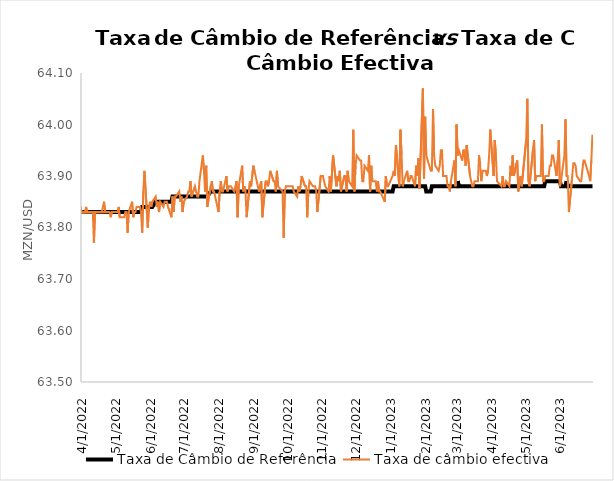
| Category | Taxa de Câmbio de Referência | Taxa de câmbio efectiva |
|---|---|---|
| 10/1/21 | 63.83 | 63.8 |
| 10/5/21 | 63.83 | 63.83 |
| 10/6/21 | 63.83 | 63.76 |
| 10/7/21 | 63.83 | 63.82 |
| 10/8/21 | 63.83 | 63.82 |
| 10/11/21 | 63.83 | 63.77 |
| 10/12/21 | 63.83 | 63.81 |
| 10/13/21 | 63.83 | 63.82 |
| 10/14/21 | 63.83 | 63.82 |
| 10/15/21 | 63.83 | 63.82 |
| 10/18/21 | 63.83 | 63.76 |
| 10/19/21 | 63.83 | 63.76 |
| 10/20/21 | 63.83 | 63.82 |
| 10/21/21 | 63.83 | 63.78 |
| 10/22/21 | 63.83 | 63.81 |
| 10/25/21 | 63.83 | 63.82 |
| 10/26/21 | 63.83 | 63.79 |
| 10/27/21 | 63.83 | 63.8 |
| 10/28/21 | 63.83 | 63.83 |
| 10/29/21 | 63.83 | 63.82 |
| 11/1/21 | 63.83 | 63.84 |
| 11/2/21 | 63.83 | 63.81 |
| 11/3/21 | 63.83 | 63.83 |
| 11/4/21 | 63.83 | 63.82 |
| 11/5/21 | 63.83 | 63.83 |
| 11/8/21 | 63.83 | 63.79 |
| 11/9/21 | 63.83 | 63.79 |
| 11/11/21 | 63.83 | 63.84 |
| 11/12/21 | 63.83 | 63.83 |
| 11/15/21 | 63.83 | 63.78 |
| 11/16/21 | 63.83 | 63.7 |
| 11/17/21 | 63.83 | 63.84 |
| 11/18/21 | 63.83 | 63.81 |
| 11/19/21 | 63.83 | 63.8 |
| 11/22/21 | 63.83 | 63.78 |
| 11/23/21 | 63.83 | 63.81 |
| 11/24/21 | 63.83 | 63.81 |
| 11/25/21 | 63.83 | 63.81 |
| 11/26/21 | 63.83 | 63.84 |
| 11/29/21 | 63.83 | 63.8 |
| 11/30/21 | 63.83 | 63.81 |
| 12/1/21 | 63.83 | 63.79 |
| 12/2/21 | 63.83 | 63.79 |
| 12/3/21 | 63.83 | 63.82 |
| 12/6/21 | 63.83 | 63.75 |
| 12/7/21 | 63.83 | 63.78 |
| 12/8/21 | 63.83 | 63.82 |
| 12/9/21 | 63.83 | 63.82 |
| 12/10/21 | 63.83 | 63.82 |
| 12/13/21 | 63.83 | 63.83 |
| 12/14/21 | 63.83 | 63.76 |
| 12/15/21 | 63.83 | 63.82 |
| 12/16/21 | 63.83 | 63.8 |
| 12/17/21 | 63.83 | 63.79 |
| 12/20/21 | 63.83 | 63.84 |
| 12/21/21 | 63.83 | 63.79 |
| 12/22/21 | 63.83 | 63.8 |
| 12/23/21 | 63.83 | 63.82 |
| 12/27/21 | 63.83 | 63.77 |
| 12/28/21 | 63.83 | 63.74 |
| 12/29/21 | 63.83 | 63.76 |
| 12/30/21 | 63.83 | 63.78 |
| 12/31/21 | 63.83 | 63.72 |
| 1/3/22 | 63.83 | 63.79 |
| 1/4/22 | 63.83 | 63.81 |
| 1/5/22 | 63.83 | 63.8 |
| 1/6/22 | 63.83 | 63.81 |
| 1/7/22 | 63.83 | 63.77 |
| 1/10/22 | 63.83 | 63.79 |
| 1/12/22 | 63.83 | 63.83 |
| 1/13/22 | 63.83 | 63.83 |
| 1/14/22 | 63.83 | 63.83 |
| 1/17/22 | 63.83 | 63.83 |
| 1/18/22 | 63.83 | 63.83 |
| 1/19/22 | 63.83 | 63.8 |
| 1/20/22 | 63.83 | 63.83 |
| 1/21/22 | 63.83 | 63.83 |
| 1/24/22 | 63.83 | 63.81 |
| 1/25/22 | 63.83 | 63.82 |
| 1/26/22 | 63.83 | 63.83 |
| 1/27/22 | 63.83 | 63.8 |
| 1/28/22 | 63.83 | 63.83 |
| 1/31/22 | 63.83 | 63.81 |
| 2/1/22 | 63.83 | 63.83 |
| 2/2/22 | 63.83 | 63.82 |
| 2/3/22 | 63.83 | 63.78 |
| 2/4/22 | 63.83 | 63.84 |
| 2/7/22 | 63.83 | 63.83 |
| 2/8/22 | 63.83 | 63.85 |
| 2/9/22 | 63.83 | 63.8 |
| 2/10/22 | 63.83 | 63.83 |
| 2/11/22 | 63.83 | 63.83 |
| 2/14/22 | 63.83 | 63.83 |
| 2/15/22 | 63.83 | 63.81 |
| 2/16/22 | 63.83 | 63.81 |
| 2/17/22 | 63.83 | 63.83 |
| 2/18/22 | 63.83 | 63.83 |
| 2/21/22 | 63.83 | 63.84 |
| 2/22/22 | 63.83 | 63.83 |
| 2/23/22 | 63.83 | 63.83 |
| 2/24/22 | 63.83 | 63.81 |
| 2/25/22 | 63.83 | 63.82 |
| 2/28/22 | 63.83 | 63.83 |
| 3/1/22 | 63.83 | 63.79 |
| 3/2/22 | 63.83 | 63.81 |
| 3/3/22 | 63.83 | 63.83 |
| 3/4/22 | 63.83 | 63.83 |
| 3/7/22 | 63.83 | 63.82 |
| 3/8/22 | 63.83 | 63.83 |
| 3/9/22 | 63.83 | 63.76 |
| 3/10/22 | 63.83 | 63.82 |
| 3/11/22 | 63.83 | 63.83 |
| 3/14/22 | 63.83 | 63.83 |
| 3/15/22 | 63.83 | 63.82 |
| 3/16/22 | 63.83 | 63.82 |
| 3/17/22 | 63.83 | 63.82 |
| 3/18/22 | 63.83 | 63.84 |
| 3/21/22 | 63.83 | 63.8 |
| 3/22/22 | 63.83 | 63.8 |
| 3/23/22 | 63.83 | 63.82 |
| 3/24/22 | 63.83 | 63.84 |
| 3/25/22 | 63.83 | 63.83 |
| 3/28/22 | 63.83 | 63.73 |
| 3/29/22 | 63.83 | 63.88 |
| 3/30/22 | 63.83 | 63.82 |
| 3/31/22 | 63.83 | 63.84 |
| 4/1/22 | 63.83 | 63.83 |
| 4/4/22 | 63.83 | 63.83 |
| 4/5/22 | 63.83 | 63.84 |
| 4/6/22 | 63.83 | 63.83 |
| 4/8/22 | 63.83 | 63.83 |
| 4/11/22 | 63.83 | 63.83 |
| 4/12/22 | 63.83 | 63.77 |
| 4/13/22 | 63.83 | 63.83 |
| 4/14/22 | 63.83 | 63.83 |
| 4/18/22 | 63.83 | 63.83 |
| 4/19/22 | 63.83 | 63.83 |
| 4/20/22 | 63.83 | 63.84 |
| 4/21/22 | 63.83 | 63.85 |
| 4/22/22 | 63.83 | 63.83 |
| 4/25/20 | 63.83 | 63.81 |
| 4/26/22 | 63.83 | 63.83 |
| 4/27/22 | 63.83 | 63.82 |
| 4/28/22 | 63.83 | 63.83 |
| 4/29/22 | 63.83 | 63.83 |
| 5/3/22 | 63.83 | 63.83 |
| 5/4/22 | 63.83 | 63.84 |
| 5/5/22 | 63.83 | 63.82 |
| 5/6/22 | 63.83 | 63.82 |
| 5/9/22 | 63.83 | 63.82 |
| 5/10/22 | 63.83 | 63.83 |
| 5/11/22 | 63.83 | 63.83 |
| 5/12/22 | 63.83 | 63.79 |
| 5/13/22 | 63.83 | 63.83 |
| 5/16/22 | 63.83 | 63.85 |
| 5/17/22 | 63.83 | 63.82 |
| 5/18/22 | 63.83 | 63.83 |
| 5/19/22 | 63.83 | 63.83 |
| 5/20/22 | 63.83 | 63.84 |
| 5/23/22 | 63.83 | 63.84 |
| 5/24/22 | 63.83 | 63.83 |
| 5/25/22 | 63.84 | 63.79 |
| 5/26/22 | 63.84 | 63.87 |
| 5/27/22 | 63.84 | 63.91 |
| 5/30/22 | 63.84 | 63.8 |
| 5/31/22 | 63.84 | 63.84 |
| 6/1/22 | 63.84 | 63.85 |
| 6/2/22 | 63.84 | 63.84 |
| 6/3/22 | 63.84 | 63.85 |
| 6/6/22 | 63.85 | 63.86 |
| 6/7/22 | 63.85 | 63.84 |
| 6/8/22 | 63.85 | 63.85 |
| 6/9/22 | 63.85 | 63.83 |
| 6/10/22 | 63.85 | 63.85 |
| 6/13/22 | 63.85 | 63.84 |
| 6/14/22 | 63.85 | 63.85 |
| 6/15/22 | 63.85 | 63.85 |
| 6/16/22 | 63.85 | 63.85 |
| 6/17/22 | 63.85 | 63.84 |
| 6/20/22 | 63.85 | 63.82 |
| 6/21/22 | 63.86 | 63.86 |
| 6/22/22 | 63.86 | 63.83 |
| 6/23/22 | 63.86 | 63.86 |
| 6/24/22 | 63.86 | 63.86 |
| 6/27/22 | 63.86 | 63.87 |
| 6/28/22 | 63.86 | 63.85 |
| 6/29/22 | 63.86 | 63.86 |
| 6/30/22 | 63.86 | 63.83 |
| 7/1/22 | 63.86 | 63.85 |
| 7/4/22 | 63.86 | 63.86 |
| 7/5/22 | 63.86 | 63.87 |
| 7/6/22 | 63.86 | 63.87 |
| 7/7/22 | 63.86 | 63.89 |
| 7/8/22 | 63.86 | 63.86 |
| 7/11/22 | 63.86 | 63.88 |
| 7/12/22 | 63.86 | 63.87 |
| 7/13/22 | 63.86 | 63.86 |
| 7/14/22 | 63.86 | 63.86 |
| 7/15/22 | 63.86 | 63.89 |
| 7/18/22 | 63.86 | 63.94 |
| 7/19/22 | 63.86 | 63.91 |
| 7/20/22 | 63.86 | 63.87 |
| 7/21/22 | 63.86 | 63.92 |
| 7/22/22 | 63.86 | 63.84 |
| 7/25/22 | 63.87 | 63.88 |
| 7/26/22 | 63.87 | 63.89 |
| 7/27/22 | 63.87 | 63.87 |
| 7/28/22 | 63.87 | 63.87 |
| 7/29/22 | 63.87 | 63.86 |
| 8/1/22 | 63.87 | 63.83 |
| 8/2/22 | 63.87 | 63.87 |
| 8/3/22 | 63.87 | 63.89 |
| 8/4/22 | 63.87 | 63.87 |
| 8/5/22 | 63.87 | 63.87 |
| 8/8/22 | 63.87 | 63.9 |
| 8/9/22 | 63.87 | 63.87 |
| 8/10/22 | 63.87 | 63.88 |
| 8/11/22 | 63.87 | 63.88 |
| 8/12/22 | 63.87 | 63.88 |
| 8/15/22 | 63.87 | 63.87 |
| 8/16/22 | 63.87 | 63.88 |
| 8/17/22 | 63.87 | 63.89 |
| 8/18/22 | 63.87 | 63.82 |
| 8/19/22 | 63.87 | 63.88 |
| 8/22/22 | 63.87 | 63.92 |
| 8/23/22 | 63.87 | 63.87 |
| 8/24/22 | 63.87 | 63.88 |
| 8/25/22 | 63.87 | 63.87 |
| 8/26/22 | 63.87 | 63.82 |
| 8/29/22 | 63.87 | 63.89 |
| 8/30/22 | 63.87 | 63.88 |
| 9/1/22 | 63.87 | 63.92 |
| 9/2/22 | 63.87 | 63.91 |
| 9/5/22 | 63.87 | 63.88 |
| 9/6/22 | 63.87 | 63.87 |
| 9/8/22 | 63.87 | 63.89 |
| 9/9/22 | 63.87 | 63.82 |
| 9/12/22 | 63.87 | 63.89 |
| 9/13/22 | 63.87 | 63.89 |
| 9/14/22 | 63.87 | 63.88 |
| 9/15/22 | 63.87 | 63.89 |
| 9/16/22 | 63.87 | 63.91 |
| 9/19/22 | 63.87 | 63.89 |
| 9/20/22 | 63.87 | 63.89 |
| 9/21/22 | 63.87 | 63.87 |
| 9/22/22 | 63.87 | 63.91 |
| 9/23/22 | 63.87 | 63.88 |
| 9/27/22 | 63.87 | 63.87 |
| 9/28/22 | 63.87 | 63.78 |
| 9/29/22 | 63.87 | 63.87 |
| 9/30/22 | 63.87 | 63.88 |
| 10/3/22 | 63.87 | 63.88 |
| 10/5/22 | 63.87 | 63.88 |
| 10/6/22 | 63.87 | 63.88 |
| 10/7/22 | 63.87 | 63.87 |
| 10/10/22 | 63.87 | 63.86 |
| 10/11/22 | 63.87 | 63.88 |
| 10/12/22 | 63.87 | 63.87 |
| 10/13/22 | 63.87 | 63.88 |
| 10/14/22 | 63.87 | 63.9 |
| 10/17/22 | 63.87 | 63.88 |
| 10/18/22 | 63.87 | 63.88 |
| 10/19/22 | 63.87 | 63.82 |
| 10/20/22 | 63.87 | 63.87 |
| 10/21/22 | 63.87 | 63.89 |
| 10/24/22 | 63.87 | 63.88 |
| 10/25/22 | 63.87 | 63.88 |
| 10/26/22 | 63.87 | 63.88 |
| 10/27/22 | 63.87 | 63.87 |
| 10/28/22 | 63.87 | 63.83 |
| 10/31/22 | 63.87 | 63.9 |
| 11/1/22 | 63.87 | 63.9 |
| 11/2/22 | 63.87 | 63.9 |
| 11/3/22 | 63.87 | 63.89 |
| 11/4/22 | 63.87 | 63.88 |
| 11/7/22 | 63.87 | 63.87 |
| 11/8/22 | 63.87 | 63.9 |
| 11/9/22 | 63.87 | 63.87 |
| 11/11/22 | 63.87 | 63.94 |
| 11/14/22 | 63.87 | 63.88 |
| 11/15/22 | 63.87 | 63.9 |
| 11/16/22 | 63.87 | 63.89 |
| 11/17/22 | 63.87 | 63.91 |
| 11/18/22 | 63.87 | 63.87 |
| 11/21/22 | 63.87 | 63.9 |
| 11/22/22 | 63.87 | 63.9 |
| 11/23/22 | 63.87 | 63.87 |
| 11/24/22 | 63.87 | 63.91 |
| 11/25/22 | 63.87 | 63.89 |
| 11/28/22 | 63.87 | 63.88 |
| 11/29/22 | 63.87 | 63.99 |
| 11/30/22 | 63.87 | 63.87 |
| 12/1/22 | 63.87 | 63.92 |
| 12/2/22 | 63.87 | 63.94 |
| 12/5/22 | 63.87 | 63.93 |
| 12/6/22 | 63.87 | 63.93 |
| 12/7/22 | 63.87 | 63.89 |
| 12/8/22 | 63.87 | 63.89 |
| 12/9/22 | 63.87 | 63.92 |
| 12/12/22 | 63.87 | 63.91 |
| 12/13/22 | 63.87 | 63.94 |
| 12/14/22 | 63.87 | 63.87 |
| 12/15/22 | 63.87 | 63.92 |
| 12/16/22 | 63.87 | 63.89 |
| 12/19/22 | 63.87 | 63.89 |
| 12/20/22 | 63.87 | 63.87 |
| 12/21/22 | 63.87 | 63.89 |
| 12/22/22 | 63.87 | 63.87 |
| 12/23/22 | 63.87 | 63.87 |
| 12/27/22 | 63.87 | 63.85 |
| 12/28/22 | 63.87 | 63.9 |
| 12/29/22 | 63.87 | 63.88 |
| 12/30/22 | 63.87 | 63.88 |
| 1/3/23 | 63.87 | 63.9 |
| 1/4/23 | 63.88 | 63.91 |
| 1/5/23 | 63.88 | 63.9 |
| 1/6/23 | 63.88 | 63.96 |
| 1/9/23 | 63.88 | 63.88 |
| 1/10/23 | 63.88 | 63.99 |
| 1/11/23 | 63.88 | 63.94 |
| 1/12/23 | 63.88 | 63.88 |
| 1/13/23 | 63.88 | 63.89 |
| 1/16/23 | 63.88 | 63.91 |
| 1/17/23 | 63.88 | 63.89 |
| 1/18/23 | 63.88 | 63.89 |
| 1/19/23 | 63.88 | 63.9 |
| 1/20/23 | 63.88 | 63.9 |
| 1/23/23 | 63.88 | 63.88 |
| 1/24/23 | 63.88 | 63.92 |
| 1/25/23 | 63.88 | 63.9 |
| 1/26/23 | 63.88 | 63.935 |
| 1/27/23 | 63.88 | 63.875 |
| 1/30/23 | 63.88 | 64.07 |
| 1/31/23 | 63.88 | 63.895 |
| 2/1/23 | 63.88 | 64.015 |
| 2/2/23 | 63.87 | 63.94 |
| 2/6/23 | 63.87 | 63.91 |
| 2/7/23 | 63.88 | 63.91 |
| 2/8/23 | 63.88 | 64.03 |
| 2/9/23 | 63.88 | 63.94 |
| 2/10/23 | 63.88 | 63.92 |
| 2/13/23 | 63.88 | 63.91 |
| 2/14/23 | 63.88 | 63.92 |
| 2/15/23 | 63.88 | 63.95 |
| 2/16/23 | 63.88 | 63.95 |
| 2/17/23 | 63.88 | 63.9 |
| 2/20/23 | 63.88 | 63.9 |
| 2/21/23 | 63.88 | 63.88 |
| 2/22/23 | 63.88 | 63.88 |
| 2/23/23 | 63.88 | 63.87 |
| 2/24/23 | 63.88 | 63.89 |
| 2/27/23 | 63.88 | 63.93 |
| 2/28/23 | 63.88 | 63.88 |
| 3/1/23 | 63.88 | 64 |
| 3/2/23 | 63.89 | 63.94 |
| 3/3/23 | 63.88 | 63.95 |
| 3/6/23 | 63.88 | 63.93 |
| 3/7/23 | 63.88 | 63.95 |
| 3/8/23 | 63.88 | 63.95 |
| 3/9/23 | 63.88 | 63.92 |
| 3/10/23 | 63.88 | 63.96 |
| 3/13/23 | 63.88 | 63.9 |
| 3/14/23 | 63.88 | 63.89 |
| 3/15/23 | 63.88 | 63.88 |
| 3/16/23 | 63.88 | 63.88 |
| 3/17/23 | 63.88 | 63.89 |
| 3/20/23 | 63.88 | 63.89 |
| 3/21/23 | 63.88 | 63.94 |
| 3/22/23 | 63.88 | 63.92 |
| 3/23/23 | 63.88 | 63.89 |
| 3/24/23 | 63.88 | 63.91 |
| 3/27/23 | 63.88 | 63.91 |
| 3/28/23 | 63.88 | 63.9 |
| 3/29/23 | 63.88 | 63.91 |
| 3/30/23 | 63.88 | 63.94 |
| 3/31/23 | 63.88 | 63.99 |
| 4/3/23 | 63.88 | 63.9 |
| 4/4/23 | 63.88 | 63.97 |
| 4/5/23 | 63.88 | 63.94 |
| 4/6/23 | 63.88 | 63.89 |
| 4/10/23 | 63.88 | 63.88 |
| 4/11/23 | 63.88 | 63.9 |
| 4/12/23 | 63.88 | 63.88 |
| 4/13/23 | 63.88 | 63.88 |
| 4/14/23 | 63.88 | 63.89 |
| 4/17/23 | 63.88 | 63.88 |
| 4/18/23 | 63.88 | 63.92 |
| 4/19/23 | 63.88 | 63.9 |
| 4/20/23 | 63.88 | 63.94 |
| 4/21/23 | 63.88 | 63.9 |
| 4/24/23 | 63.88 | 63.93 |
| 4/25/23 | 63.88 | 63.87 |
| 4/26/23 | 63.88 | 63.89 |
| 4/27/23 | 63.88 | 63.9 |
| 4/28/23 | 63.88 | 63.88 |
| 5/2/23 | 63.88 | 63.97 |
| 5/3/23 | 63.88 | 64.05 |
| 5/4/23 | 63.88 | 63.89 |
| 5/5/23 | 63.88 | 63.88 |
| 5/8/23 | 63.88 | 63.95 |
| 5/9/23 | 63.88 | 63.97 |
| 5/10/23 | 63.88 | 63.89 |
| 5/11/23 | 63.88 | 63.9 |
| 5/12/23 | 63.88 | 63.9 |
| 5/15/23 | 63.88 | 63.9 |
| 5/16/23 | 63.88 | 64 |
| 5/17/23 | 63.88 | 63.89 |
| 5/18/23 | 63.88 | 63.89 |
| 5/19/23 | 63.89 | 63.9 |
| 5/22/23 | 63.89 | 63.9 |
| 5/23/23 | 63.89 | 63.92 |
| 5/24/23 | 63.89 | 63.92 |
| 5/25/23 | 63.89 | 63.94 |
| 5/26/23 | 63.89 | 63.94 |
| 5/29/23 | 63.89 | 63.9 |
| 5/30/23 | 63.89 | 63.93 |
| 5/31/23 | 63.89 | 63.97 |
| 6/1/23 | 63.89 | 63.88 |
| 6/2/23 | 63.88 | 63.89 |
| 6/5/23 | 63.88 | 63.94 |
| 6/6/23 | 63.88 | 64.01 |
| 6/7/23 | 63.89 | 63.9 |
| 6/8/23 | 63.88 | 63.9 |
| 6/9/23 | 63.88 | 63.83 |
| 6/12/23 | 63.88 | 63.9 |
| 6/13/23 | 63.88 | 63.925 |
| 6/14/23 | 63.88 | 63.925 |
| 6/15/23 | 63.88 | 63.92 |
| 6/16/23 | 63.88 | 63.9 |
| 6/19/23 | 63.88 | 63.89 |
| 6/20/23 | 63.88 | 63.89 |
| 6/21/23 | 63.88 | 63.91 |
| 6/22/23 | 63.88 | 63.93 |
| 6/23/23 | 63.88 | 63.93 |
| 6/27/23 | 63.88 | 63.9 |
| 6/28/23 | 63.88 | 63.89 |
| 6/29/23 | 63.88 | 63.93 |
| 6/30/23 | 63.88 | 63.98 |